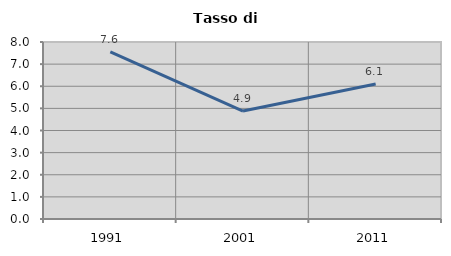
| Category | Tasso di disoccupazione   |
|---|---|
| 1991.0 | 7.555 |
| 2001.0 | 4.878 |
| 2011.0 | 6.103 |